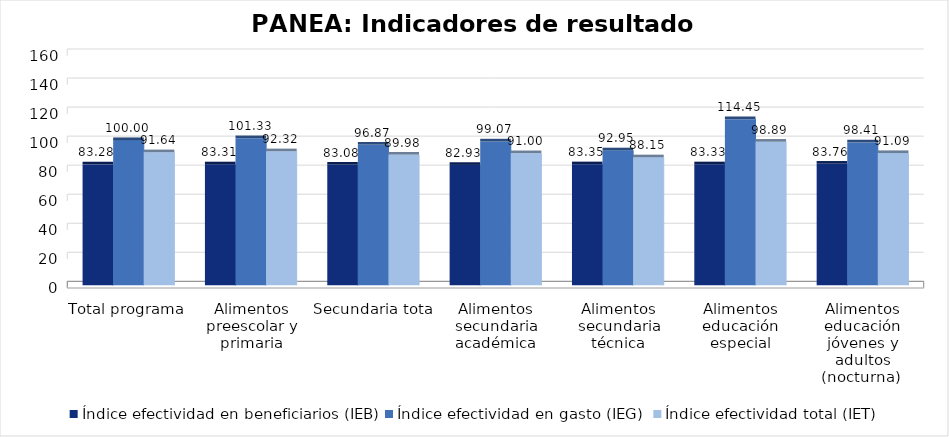
| Category | Índice efectividad en beneficiarios (IEB) | Índice efectividad en gasto (IEG)  | Índice efectividad total (IET) |
|---|---|---|---|
| Total programa | 83.282 | 100 | 91.641 |
| Alimentos preescolar y primaria | 83.31 | 101.332 | 92.321 |
| Secundaria total | 83.08 | 96.874 | 89.977 |
| Alimentos secundaria académica | 82.925 | 99.074 | 91 |
| Alimentos secundaria técnica | 83.352 | 92.952 | 88.152 |
| Alimentos educación especial | 83.333 | 114.446 | 98.89 |
| Alimentos educación jóvenes y adultos (nocturna)  | 83.757 | 98.413 | 91.085 |